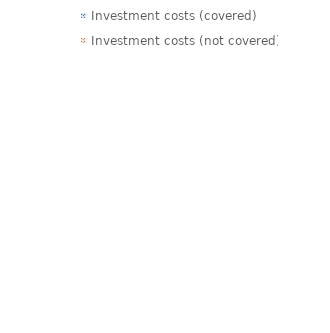
| Category | Series 0 |
|---|---|
| Investment costs (covered) | 0 |
| Investment costs (not covered) | 0 |